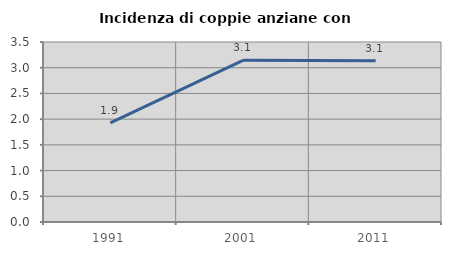
| Category | Incidenza di coppie anziane con figli |
|---|---|
| 1991.0 | 1.927 |
| 2001.0 | 3.143 |
| 2011.0 | 3.137 |